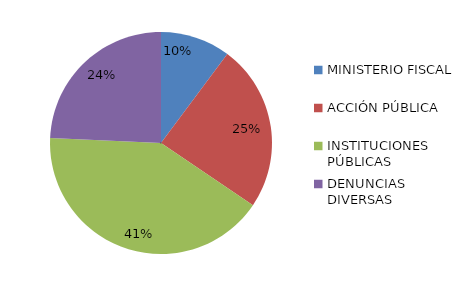
| Category | Series 0 |
|---|---|
| MINISTERIO FISCAL | 21 |
| ACCIÓN PÚBLICA | 50 |
| INSTITUCIONES PÚBLICAS | 85 |
| DENUNCIAS DIVERSAS | 50 |